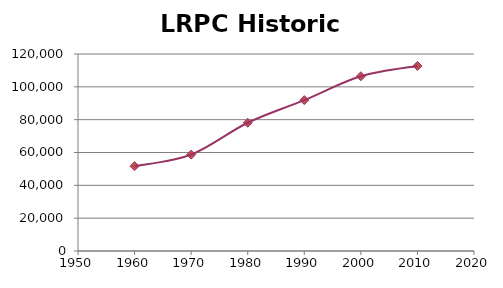
| Category | Series 0 |
|---|---|
| 1960.0 | 51676 |
| 1970.0 | 58714 |
| 1980.0 | 78126 |
| 1990.0 | 91900 |
| 2000.0 | 106428 |
| 2010.0 | 112735 |